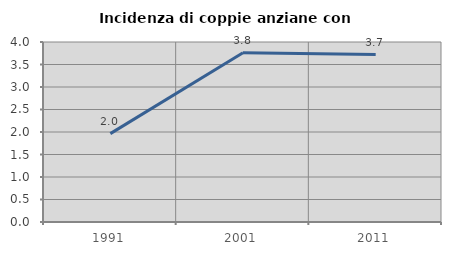
| Category | Incidenza di coppie anziane con figli |
|---|---|
| 1991.0 | 1.964 |
| 2001.0 | 3.762 |
| 2011.0 | 3.72 |